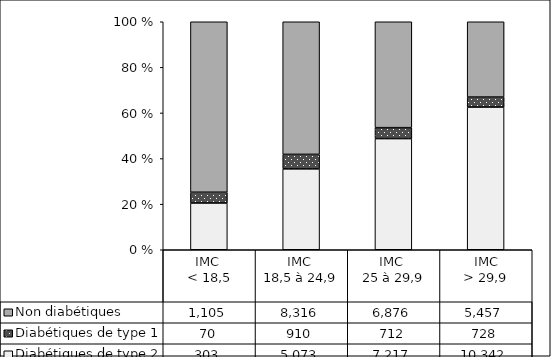
| Category | Diabétiques de type 2 | Diabétiques de type 1 | Non diabétiques |
|---|---|---|---|
| IMC 
< 18,5 | 303 | 70 | 1105 |
| IMC 
18,5 à 24,9 | 5073 | 910 | 8316 |
| IMC 
25 à 29,9 | 7217 | 712 | 6876 |
| IMC
> 29,9 | 10342 | 728 | 5457 |